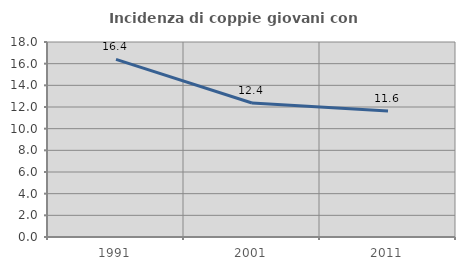
| Category | Incidenza di coppie giovani con figli |
|---|---|
| 1991.0 | 16.396 |
| 2001.0 | 12.371 |
| 2011.0 | 11.62 |